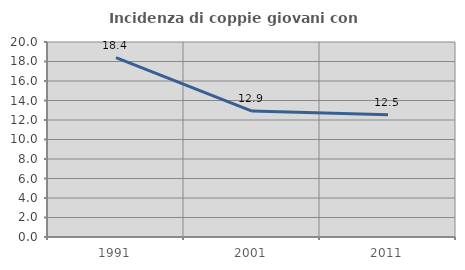
| Category | Incidenza di coppie giovani con figli |
|---|---|
| 1991.0 | 18.403 |
| 2001.0 | 12.917 |
| 2011.0 | 12.539 |